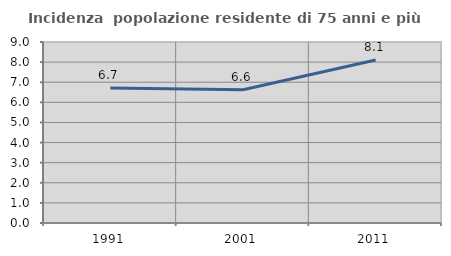
| Category | Incidenza  popolazione residente di 75 anni e più |
|---|---|
| 1991.0 | 6.715 |
| 2001.0 | 6.63 |
| 2011.0 | 8.108 |